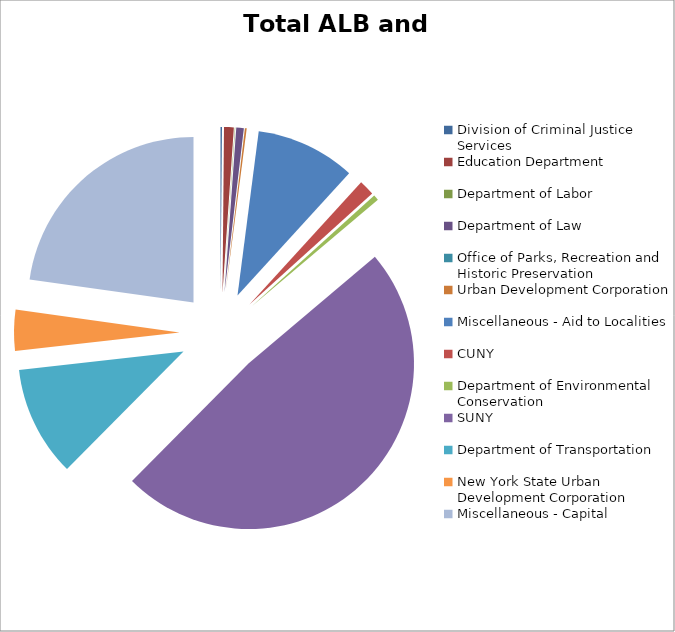
| Category | Series 0 |
|---|---|
| Division of Criminal Justice Services | 15989000 |
| Education Department | 105681000 |
| Department of Labor | 4355500 |
| Department of Law | 81500234 |
| Office of Parks, Recreation and Historic Preservation | 1000000 |
| Urban Development Corporation | 19000000 |
| Miscellaneous - Aid to Localities | 1081754736 |
| CUNY | 167500000 |
| Department of Environmental Conservation | 60000000 |
| SUNY | 5400100000 |
| Department of Transportation | 1198625000 |
| New York State Urban Development Corporation | 444386000 |
| Miscellaneous - Capital | 2531675000 |